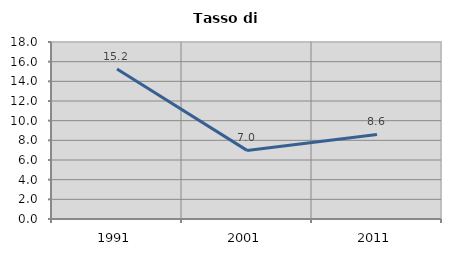
| Category | Tasso di disoccupazione   |
|---|---|
| 1991.0 | 15.248 |
| 2001.0 | 6.977 |
| 2011.0 | 8.597 |